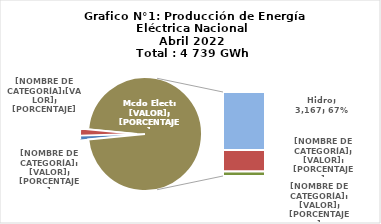
| Category | Series 0 |
|---|---|
| 0 | 50.121 |
| 1 | 93.082 |
| 2 | 3166.933 |
| 3 | 1182.123 |
| 4 | 247.062 |